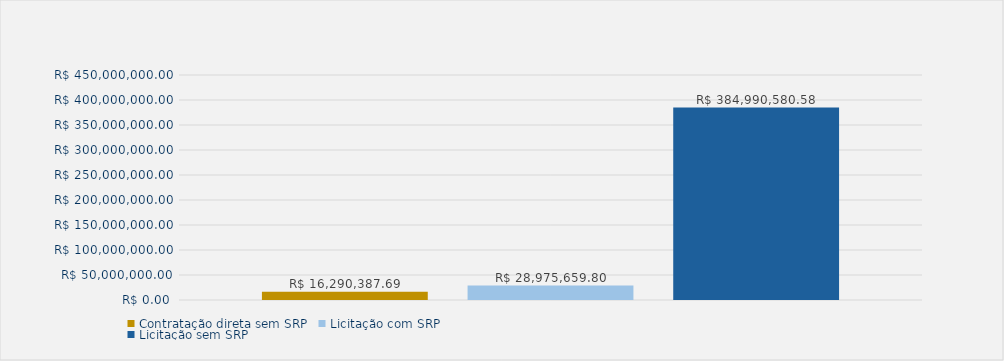
| Category | Contratação direta sem SRP | Licitação com SRP | Licitação sem SRP |
|---|---|---|---|
| Total | 16290387.69 | 28975659.8 | 384990580.58 |